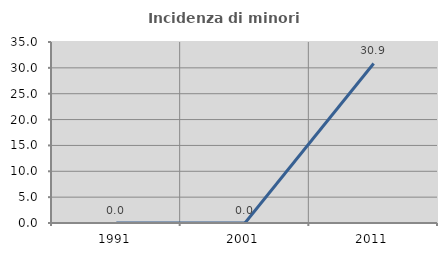
| Category | Incidenza di minori stranieri |
|---|---|
| 1991.0 | 0 |
| 2001.0 | 0 |
| 2011.0 | 30.851 |